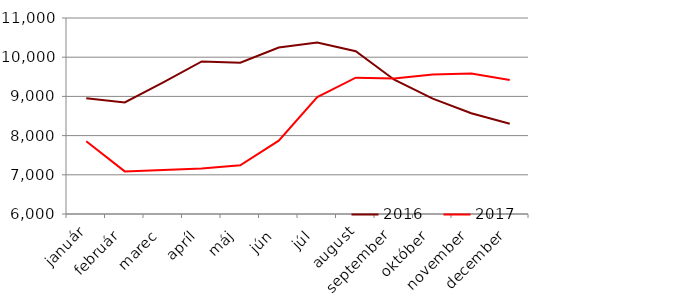
| Category | 2016 | 2017 |
|---|---|---|
| 0 | 8955 | 7855 |
| 1 | 8846 | 7087 |
| 2 | 9360 | 7123 |
| 3 | 9891 | 7159 |
| 4 | 9860 | 7244 |
| 5 | 10247 | 7870 |
| 6 | 10375 | 8985 |
| 7 | 10152 | 9477 |
| 8 | 9425 | 9455 |
| 9 | 8944 | 9560 |
| 10 | 8570 | 9582 |
| 11 | 8301 | 9419 |